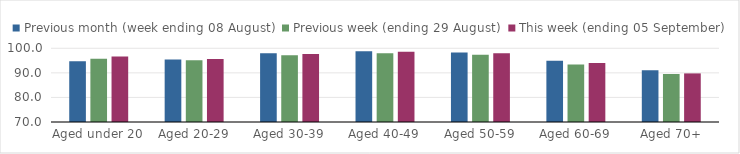
| Category | Previous month (week ending 08 August) | Previous week (ending 29 August) | This week (ending 05 September) |
|---|---|---|---|
| Aged under 20 | 94.68 | 95.71 | 96.62 |
| Aged 20-29 | 95.42 | 95.15 | 95.67 |
| Aged 30-39 | 97.96 | 97.17 | 97.7 |
| Aged 40-49 | 98.8 | 97.98 | 98.62 |
| Aged 50-59 | 98.32 | 97.41 | 98.03 |
| Aged 60-69 | 94.88 | 93.37 | 94.05 |
| Aged 70+ | 91.04 | 89.53 | 89.78 |